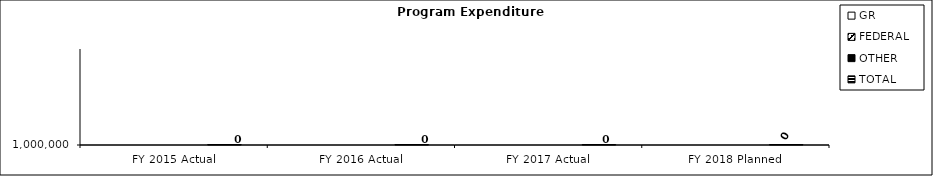
| Category | GR | FEDERAL | OTHER | TOTAL |
|---|---|---|---|---|
| FY 2015 Actual |  |  |  | 0 |
| FY 2016 Actual |  |  |  | 0 |
| FY 2017 Actual |  |  |  | 0 |
| FY 2018 Planned |  |  |  | 0 |